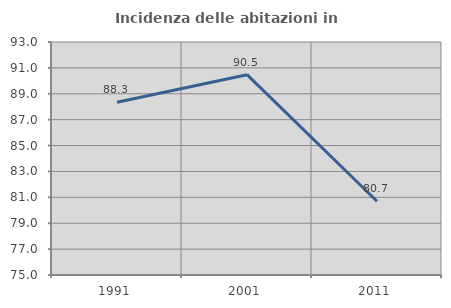
| Category | Incidenza delle abitazioni in proprietà  |
|---|---|
| 1991.0 | 88.35 |
| 2001.0 | 90.476 |
| 2011.0 | 80.699 |